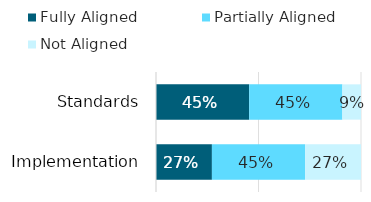
| Category | Fully Aligned | Partially Aligned | Not Aligned |
|---|---|---|---|
| Standards | 0.455 | 0.455 | 0.091 |
| Implementation | 0.273 | 0.455 | 0.273 |